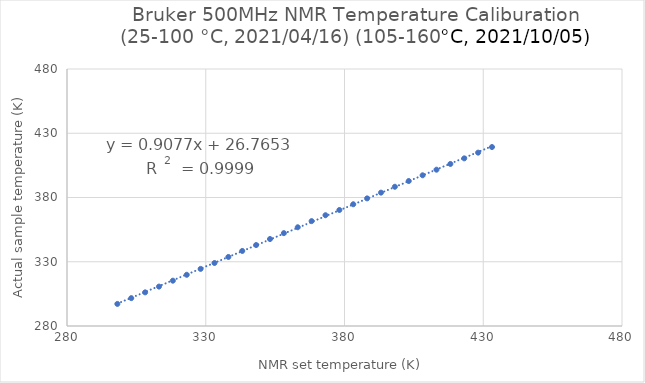
| Category | actual T(K) |
|---|---|
| 298.15 | 297.18 |
| 303.15 | 301.68 |
| 308.15 | 306.18 |
| 313.15 | 310.67 |
| 318.15 | 315.26 |
| 323.15 | 319.85 |
| 328.15 | 324.45 |
| 333.15 | 329.03 |
| 338.15 | 333.72 |
| 343.15 | 338.41 |
| 348.15 | 343 |
| 353.15 | 347.68 |
| 358.15 | 352.26 |
| 363.15 | 356.84 |
| 368.15 | 361.62 |
| 373.15 | 366.2 |
| 378.15 | 370.27 |
| 383.15 | 374.74 |
| 388.15 | 379.31 |
| 393.15 | 383.78 |
| 398.15 | 388.35 |
| 403.15 | 392.81 |
| 408.15 | 397.28 |
| 413.15 | 401.64 |
| 418.15 | 406.1 |
| 423.15 | 410.46 |
| 428.15 | 414.91 |
| 433.15 | 419.27 |